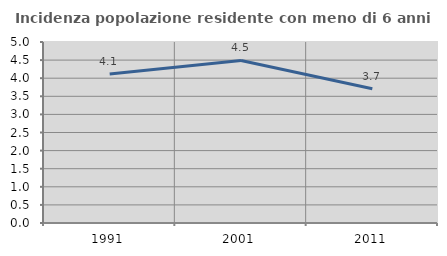
| Category | Incidenza popolazione residente con meno di 6 anni |
|---|---|
| 1991.0 | 4.116 |
| 2001.0 | 4.491 |
| 2011.0 | 3.708 |